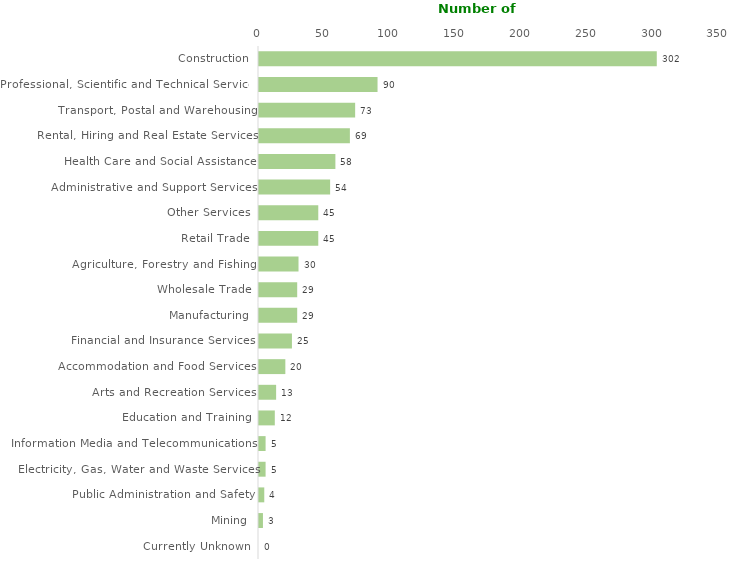
| Category | Series 0 |
|---|---|
| Construction | 302 |
| Professional, Scientific and Technical Services | 90 |
| Transport, Postal and Warehousing | 73 |
| Rental, Hiring and Real Estate Services | 69 |
| Health Care and Social Assistance | 58 |
| Administrative and Support Services | 54 |
| Other Services | 45 |
| Retail Trade | 45 |
| Agriculture, Forestry and Fishing | 30 |
| Wholesale Trade | 29 |
| Manufacturing | 29 |
| Financial and Insurance Services | 25 |
| Accommodation and Food Services | 20 |
| Arts and Recreation Services | 13 |
| Education and Training | 12 |
| Information Media and Telecommunications | 5 |
| Electricity, Gas, Water and Waste Services | 5 |
| Public Administration and Safety | 4 |
| Mining | 3 |
| Currently Unknown | 0 |